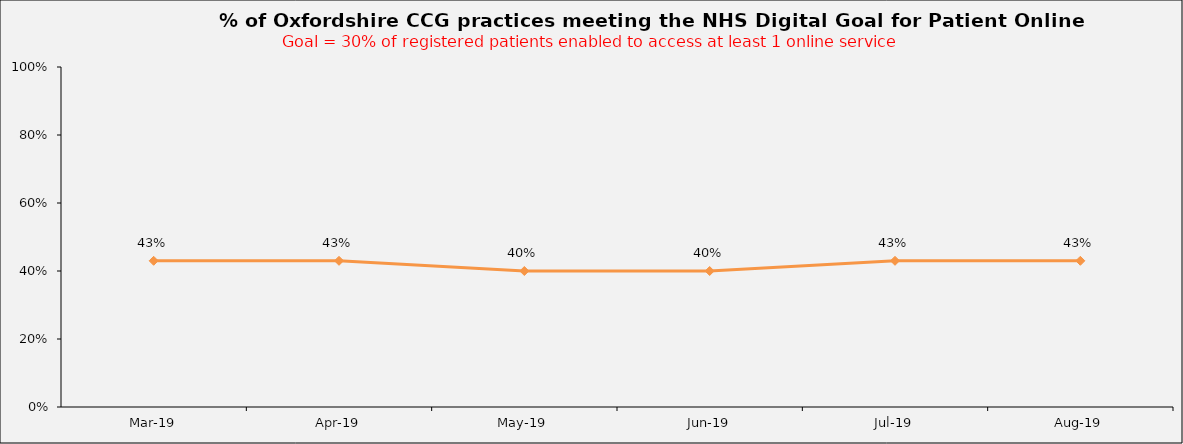
| Category | Series 0 |
|---|---|
| 2019-03-01 | 0.43 |
| 2019-04-01 | 0.43 |
| 2019-05-01 | 0.4 |
| 2019-06-01 | 0.4 |
| 2019-07-01 | 0.43 |
| 2019-08-01 | 0.43 |